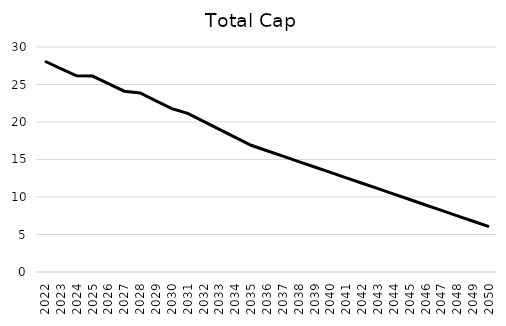
| Category | Total Cap |
|---|---|
| 2022.0 | 28.101 |
| 2023.0 | 27.128 |
| 2024.0 | 26.155 |
| 2025.0 | 26.124 |
| 2026.0 | 25.115 |
| 2027.0 | 24.105 |
| 2028.0 | 23.865 |
| 2029.0 | 22.822 |
| 2030.0 | 21.78 |
| 2031.0 | 21.147 |
| 2032.0 | 20.084 |
| 2033.0 | 19.021 |
| 2034.0 | 17.958 |
| 2035.0 | 16.894 |
| 2036.0 | 16.171 |
| 2037.0 | 15.448 |
| 2038.0 | 14.724 |
| 2039.0 | 14.001 |
| 2040.0 | 13.278 |
| 2041.0 | 12.554 |
| 2042.0 | 11.831 |
| 2043.0 | 11.108 |
| 2044.0 | 10.384 |
| 2045.0 | 9.661 |
| 2046.0 | 8.938 |
| 2047.0 | 8.214 |
| 2048.0 | 7.491 |
| 2049.0 | 6.767 |
| 2050.0 | 6.044 |